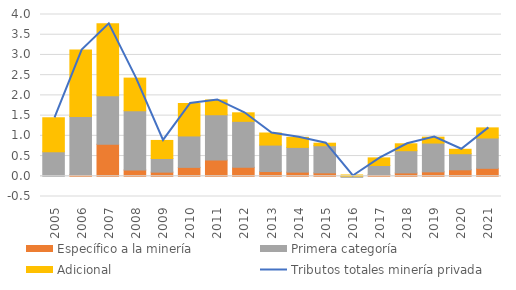
| Category | Específico a la minería | Primera categoría | Adicional |
|---|---|---|---|
| 2005.0 | 0 | 0.606 | 0.841 |
| 2006.0 | 0.038 | 1.439 | 1.644 |
| 2007.0 | 0.792 | 1.201 | 1.775 |
| 2008.0 | 0.155 | 1.465 | 0.807 |
| 2009.0 | 0.102 | 0.337 | 0.447 |
| 2010.0 | 0.22 | 0.777 | 0.802 |
| 2011.0 | 0.4 | 1.122 | 0.366 |
| 2012.0 | 0.221 | 1.137 | 0.211 |
| 2013.0 | 0.117 | 0.654 | 0.298 |
| 2014.0 | 0.102 | 0.612 | 0.249 |
| 2015.0 | 0.085 | 0.67 | 0.062 |
| 2016.0 | -0.001 | -0.024 | 0.033 |
| 2017.0 | 0.04 | 0.226 | 0.189 |
| 2018.0 | 0.083 | 0.549 | 0.171 |
| 2019.0 | 0.109 | 0.712 | 0.146 |
| 2020.0 | 0.16 | 0.398 | 0.109 |
| 2021.0 | 0.197 | 0.75 | 0.25 |